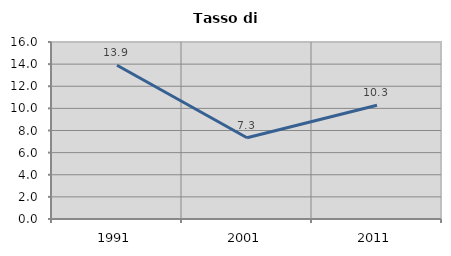
| Category | Tasso di disoccupazione   |
|---|---|
| 1991.0 | 13.9 |
| 2001.0 | 7.344 |
| 2011.0 | 10.288 |